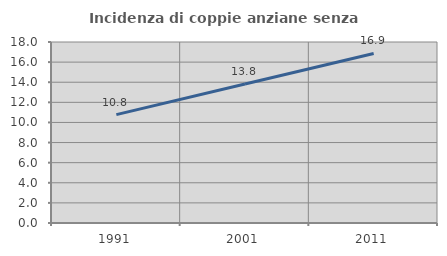
| Category | Incidenza di coppie anziane senza figli  |
|---|---|
| 1991.0 | 10.776 |
| 2001.0 | 13.816 |
| 2011.0 | 16.856 |